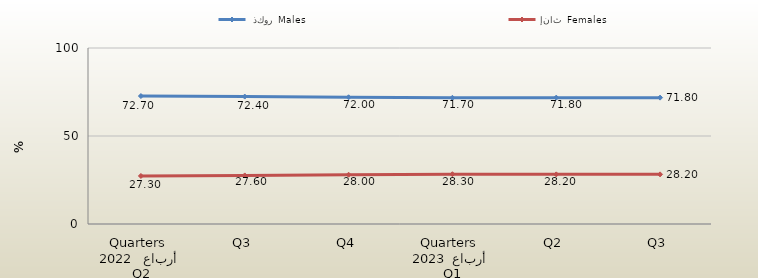
| Category |  ذكور  Males | إناث  Females |
|---|---|---|
| 0 | 72.7 | 27.3 |
| 1 | 72.4 | 27.6 |
| 2 | 72 | 28 |
| 3 | 71.7 | 28.3 |
| 4 | 71.8 | 28.2 |
| 5 | 71.8 | 28.2 |